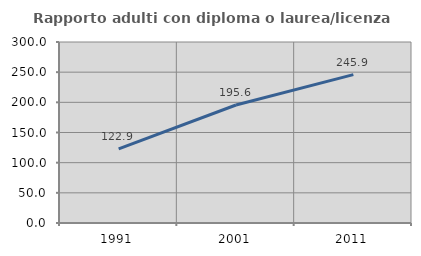
| Category | Rapporto adulti con diploma o laurea/licenza media  |
|---|---|
| 1991.0 | 122.857 |
| 2001.0 | 195.614 |
| 2011.0 | 245.946 |